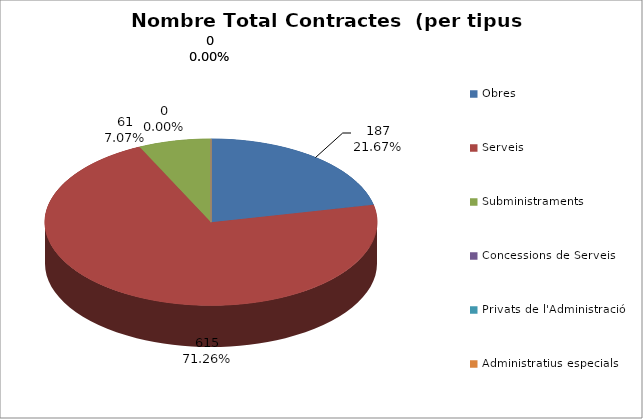
| Category | Nombre Total Contractes |
|---|---|
| Obres | 187 |
| Serveis | 615 |
| Subministraments | 61 |
| Concessions de Serveis | 0 |
| Privats de l'Administració | 0 |
| Administratius especials | 0 |